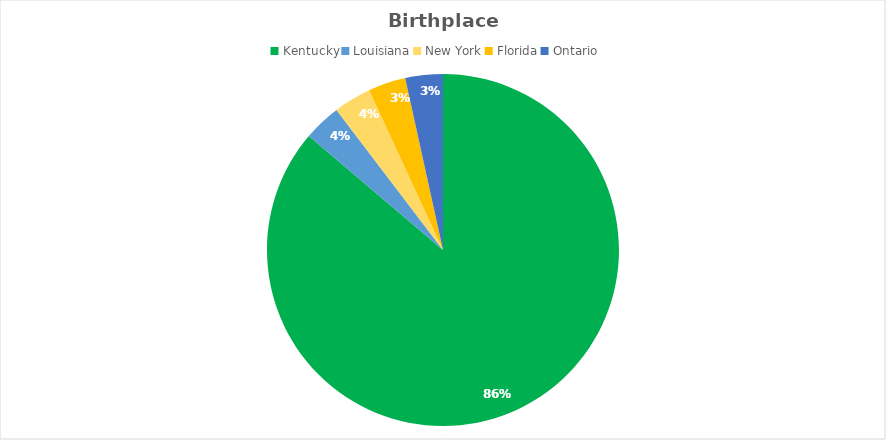
| Category | Series 0 |
|---|---|
| Kentucky | 25 |
| Louisiana | 1 |
| New York | 1 |
| Florida | 1 |
| Ontario | 1 |